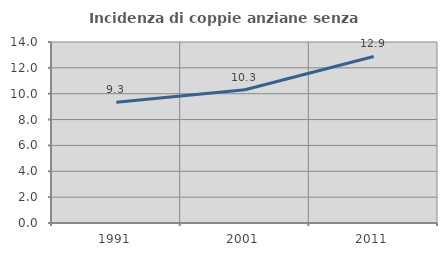
| Category | Incidenza di coppie anziane senza figli  |
|---|---|
| 1991.0 | 9.333 |
| 2001.0 | 10.307 |
| 2011.0 | 12.881 |